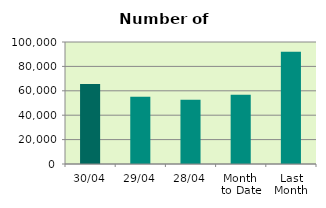
| Category | Series 0 |
|---|---|
| 30/04 | 65602 |
| 29/04 | 55140 |
| 28/04 | 52644 |
| Month 
to Date | 56719.3 |
| Last
Month | 92104.455 |